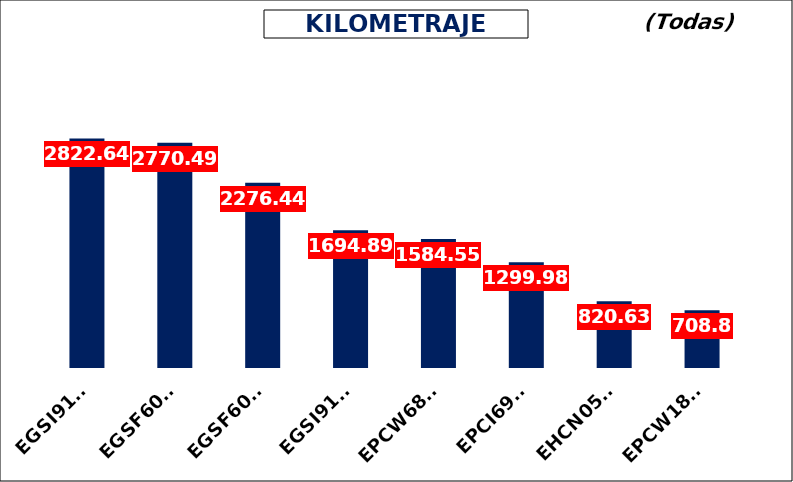
| Category | Total |
|---|---|
| EGSI9191 | 2822.64 |
| EGSF6046 | 2770.49 |
| EGSF6029 | 2276.44 |
| EGSI9179 | 1694.89 |
| EPCW6826 | 1584.55 |
| EPCI6941 | 1299.98 |
| EHCN0517 | 820.63 |
| EPCW1831 | 708.8 |